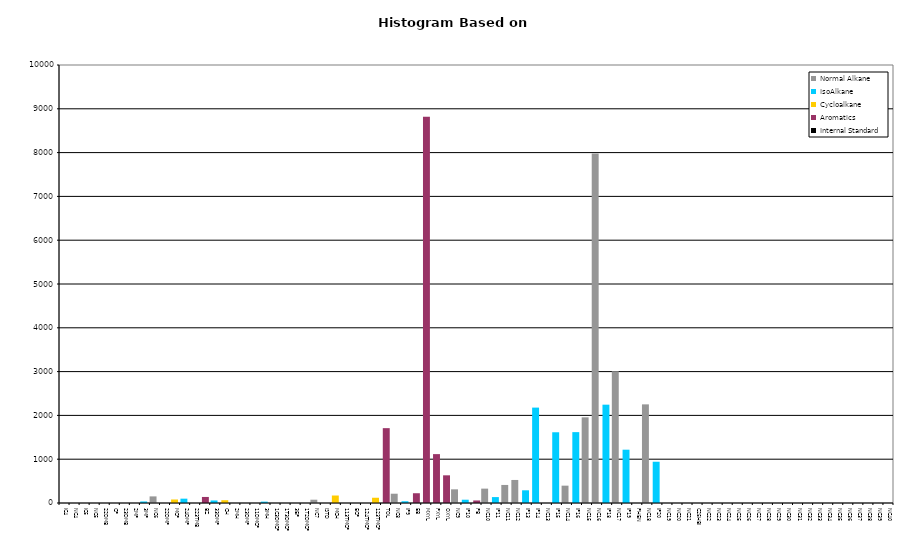
| Category | Normal Alkane | IsoAlkane | Cycloalkane | Aromatics | Internal Standard |
|---|---|---|---|---|---|
| IC4 | 0 | 0 | 0 | 0 | 0 |
| NC4 | 0 | 0 | 0 | 0 | 0 |
| IC5 | 0 | 0 | 0 | 0 | 0 |
| NC5 | 0 | 0 | 0 | 0 | 0 |
| 22DMB | 0 | 0 | 0 | 0 | 0 |
| CP | 0 | 0 | 0 | 0 | 0 |
| 23DMB | 0 | 0 | 0 | 0 | 0 |
| 2MP | 0 | 0 | 0 | 0 | 0 |
| 3MP | 0 | 35 | 0 | 0 | 0 |
| NC6 | 151 | 0 | 0 | 0 | 0 |
| 22DMP | 0 | 0 | 0 | 0 | 0 |
| MCP | 0 | 0 | 80 | 0 | 0 |
| 24DMP | 0 | 99 | 0 | 0 | 0 |
| 223TMB | 0 | 0 | 0 | 0 | 0 |
| BZ | 0 | 0 | 0 | 138 | 0 |
| 33DMP | 0 | 58 | 0 | 0 | 0 |
| CH | 0 | 0 | 64 | 0 | 0 |
| 2MH | 0 | 0 | 0 | 0 | 0 |
| 23DMP | 0 | 0 | 0 | 0 | 0 |
| 11DMCP | 0 | 0 | 0 | 0 | 0 |
| 3MH | 0 | 31 | 0 | 0 | 0 |
| 1C3DMCP | 0 | 0 | 0 | 0 | 0 |
| 1T3DMCP | 0 | 0 | 0 | 0 | 0 |
| 3EP | 0 | 0 | 0 | 0 | 0 |
| 1T2DMCP | 0 | 0 | 0 | 0 | 0 |
| NC7 | 75 | 0 | 0 | 0 | 0 |
| ISTD | 0 | 0 | 0 | 0 | 0 |
| MCH | 0 | 0 | 171 | 0 | 0 |
| 113TMCP | 0 | 0 | 0 | 0 | 0 |
| ECP | 0 | 0 | 0 | 0 | 0 |
| 124TMCP | 0 | 0 | 0 | 0 | 0 |
| 123TMCP | 0 | 0 | 120 | 0 | 0 |
| TOL | 0 | 0 | 0 | 1709 | 0 |
| NC8 | 212 | 0 | 0 | 0 | 0 |
| IP9 | 0 | 40 | 0 | 0 | 0 |
| EB | 0 | 0 | 0 | 223 | 0 |
| MXYL | 0 | 0 | 0 | 8816 | 0 |
| PXYL | 0 | 0 | 0 | 1116 | 0 |
| OXYL | 0 | 0 | 0 | 632 | 0 |
| NC9 | 312 | 0 | 0 | 0 | 0 |
| IP10 | 0 | 75 | 0 | 0 | 0 |
| PB | 0 | 0 | 0 | 58 | 0 |
| NC10 | 328 | 0 | 0 | 0 | 0 |
| IP11 | 0 | 135 | 0 | 0 | 0 |
| NC11 | 412 | 0 | 0 | 0 | 0 |
| NC12 | 526 | 0 | 0 | 0 | 0 |
| IP13 | 0 | 290 | 0 | 0 | 0 |
| IP14 | 0 | 2178 | 0 | 0 | 0 |
| NC13 | 0 | 0 | 0 | 0 | 0 |
| IP15 | 0 | 1615 | 0 | 0 | 0 |
| NC14 | 396 | 0 | 0 | 0 | 0 |
| IP16 | 0 | 1618 | 0 | 0 | 0 |
| NC15 | 1956 | 0 | 0 | 0 | 0 |
| NC16 | 7978 | 0 | 0 | 0 | 0 |
| IP18 | 0 | 2245 | 0 | 0 | 0 |
| NC17 | 3008 | 0 | 0 | 0 | 0 |
| IP19 | 0 | 1217 | 0 | 0 | 0 |
| PHEN | 0 | 0 | 0 | 0 | 0 |
| NC18 | 2252 | 0 | 0 | 0 | 0 |
| IP20 | 0 | 942 | 0 | 0 | 0 |
| NC19 | 0 | 0 | 0 | 0 | 0 |
| NC20 | 0 | 0 | 0 | 0 | 0 |
| NC21 | 0 | 0 | 0 | 0 | 0 |
| C25HBI | 0 | 0 | 0 | 0 | 0 |
| NC22 | 0 | 0 | 0 | 0 | 0 |
| NC23 | 0 | 0 | 0 | 0 | 0 |
| NC24 | 0 | 0 | 0 | 0 | 0 |
| NC25 | 0 | 0 | 0 | 0 | 0 |
| NC26 | 0 | 0 | 0 | 0 | 0 |
| NC27 | 0 | 0 | 0 | 0 | 0 |
| NC28 | 0 | 0 | 0 | 0 | 0 |
| NC29 | 0 | 0 | 0 | 0 | 0 |
| NC30 | 0 | 0 | 0 | 0 | 0 |
| NC31 | 0 | 0 | 0 | 0 | 0 |
| NC32 | 0 | 0 | 0 | 0 | 0 |
| NC33 | 0 | 0 | 0 | 0 | 0 |
| NC34 | 0 | 0 | 0 | 0 | 0 |
| NC35 | 0 | 0 | 0 | 0 | 0 |
| NC36 | 0 | 0 | 0 | 0 | 0 |
| NC37 | 0 | 0 | 0 | 0 | 0 |
| NC38 | 0 | 0 | 0 | 0 | 0 |
| NC39 | 0 | 0 | 0 | 0 | 0 |
| NC40 | 0 | 0 | 0 | 0 | 0 |